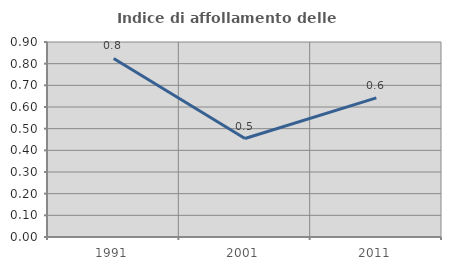
| Category | Indice di affollamento delle abitazioni  |
|---|---|
| 1991.0 | 0.824 |
| 2001.0 | 0.455 |
| 2011.0 | 0.642 |